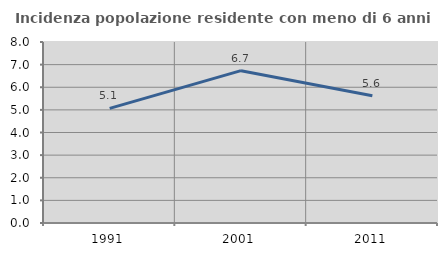
| Category | Incidenza popolazione residente con meno di 6 anni |
|---|---|
| 1991.0 | 5.066 |
| 2001.0 | 6.733 |
| 2011.0 | 5.626 |